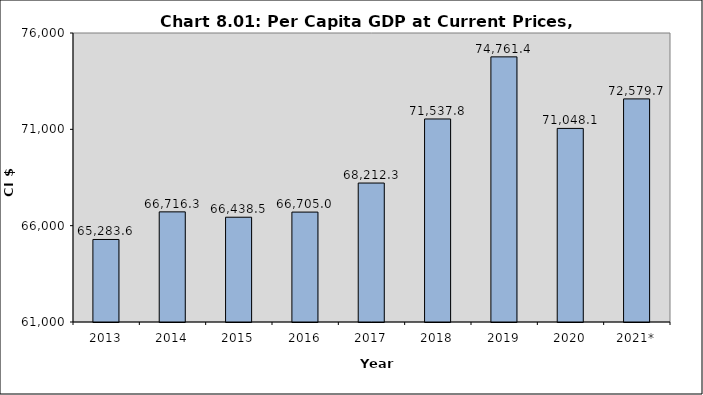
| Category | Series 0 |
|---|---|
| 2013 | 65283.559 |
| 2014 | 66716.312 |
| 2015 | 66438.463 |
| 2016 | 66705 |
| 2017 | 68212.3 |
| 2018 | 71537.8 |
| 2019 | 74761.4 |
| 2020 | 71048.106 |
| 2021* | 72579.706 |